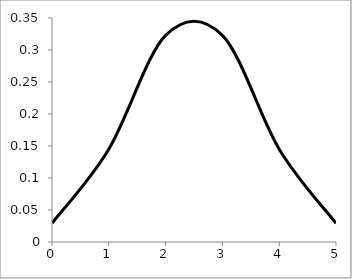
| Category | Series 0 |
|---|---|
| 0.0 | 0.029 |
| 1.0 | 0.145 |
| 2.0 | 0.323 |
| 3.0 | 0.323 |
| 4.0 | 0.145 |
| 5.0 | 0.029 |